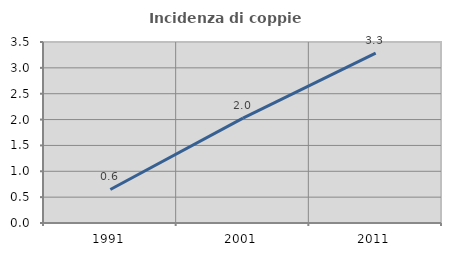
| Category | Incidenza di coppie miste |
|---|---|
| 1991.0 | 0.648 |
| 2001.0 | 2.029 |
| 2011.0 | 3.284 |